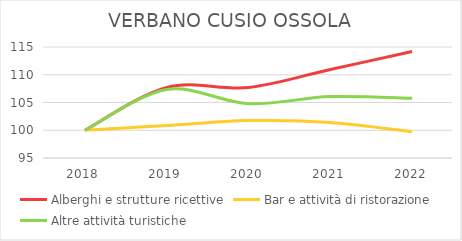
| Category | Alberghi e strutture ricettive | Bar e attività di ristorazione | Altre attività turistiche |
|---|---|---|---|
| 2018.0 | 100 | 100 | 100 |
| 2019.0 | 107.711 | 100.838 | 107.348 |
| 2020.0 | 107.711 | 101.74 | 104.792 |
| 2021.0 | 110.945 | 101.418 | 106.07 |
| 2022.0 | 114.179 | 99.742 | 105.751 |